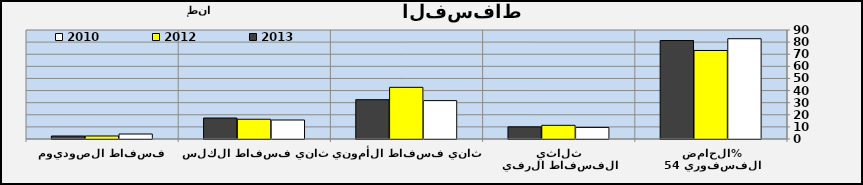
| Category | 2010 | 2012 | 2013 |
|---|---|---|---|
| الحامض الفسفوري 54% | 82.808 | 73.106 | 81.28 |
| ثلاثي الفسفاط الرفيع | 9.572 | 11.289 | 10.019 |
| ثاني فسفاط الأمونيا | 31.697 | 42.652 | 32.455 |
| ثاني فسفاط الكلس | 15.685 | 16.302 | 17.334 |
| فسفاط الصوديوم  | 4.123 | 2.481 | 2.47 |